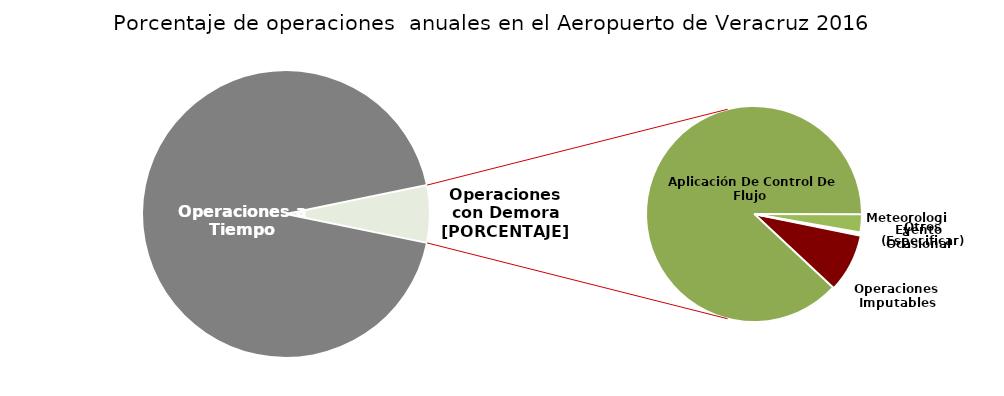
| Category | Series 0 |
|---|---|
| Operaciones a Tiempo | 15470 |
| Operaciones Imputables | 93 |
| Aplicación De Control De Flujo  | 937 |
| Meteorologia | 29 |
| Evento Ocasional | 2 |
| Otros (Especificar) | 3 |